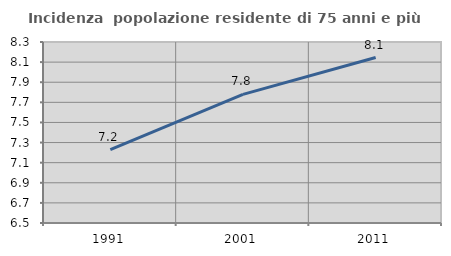
| Category | Incidenza  popolazione residente di 75 anni e più |
|---|---|
| 1991.0 | 7.231 |
| 2001.0 | 7.78 |
| 2011.0 | 8.146 |